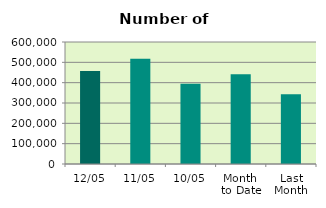
| Category | Series 0 |
|---|---|
| 12/05 | 456878 |
| 11/05 | 517266 |
| 10/05 | 394414 |
| Month 
to Date | 440886.75 |
| Last
Month | 343067.2 |